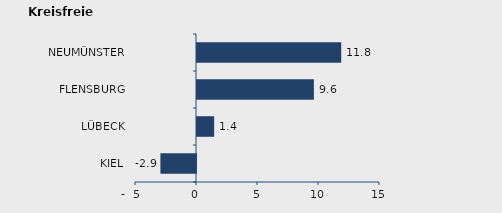
| Category | Wanderungssaldo |
|---|---|
| KIEL | -2.917 |
| LÜBECK | 1.404 |
| FLENSBURG | 9.583 |
| NEUMÜNSTER | 11.821 |